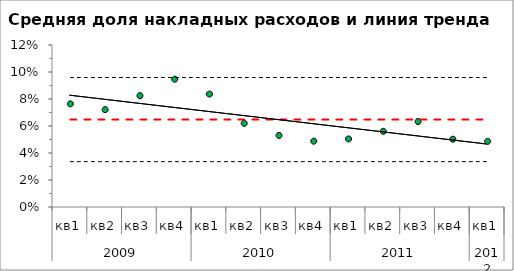
| Category | Доля накладных расходов | μ-2σ | μ | μ+2σ |
|---|---|---|---|---|
| 0 | 0.076 | 0.034 | 0.065 | 0.096 |
| 1 | 0.072 | 0.034 | 0.065 | 0.096 |
| 2 | 0.082 | 0.034 | 0.065 | 0.096 |
| 3 | 0.095 | 0.034 | 0.065 | 0.096 |
| 4 | 0.084 | 0.034 | 0.065 | 0.096 |
| 5 | 0.062 | 0.034 | 0.065 | 0.096 |
| 6 | 0.053 | 0.034 | 0.065 | 0.096 |
| 7 | 0.049 | 0.034 | 0.065 | 0.096 |
| 8 | 0.05 | 0.034 | 0.065 | 0.096 |
| 9 | 0.056 | 0.034 | 0.065 | 0.096 |
| 10 | 0.063 | 0.034 | 0.065 | 0.096 |
| 11 | 0.05 | 0.034 | 0.065 | 0.096 |
| 12 | 0.049 | 0.034 | 0.065 | 0.096 |